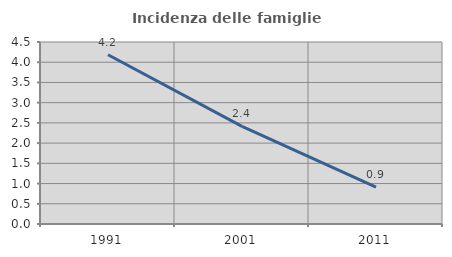
| Category | Incidenza delle famiglie numerose |
|---|---|
| 1991.0 | 4.185 |
| 2001.0 | 2.415 |
| 2011.0 | 0.909 |